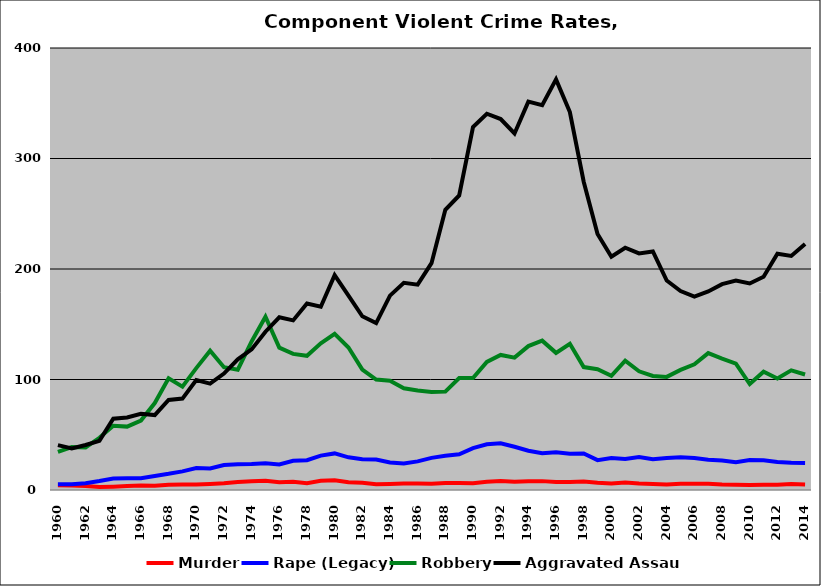
| Category | Murder | Rape (Legacy) | Robbery | Aggravated Assault |
|---|---|---|---|---|
| 1960.0 | 4.375 | 5.147 | 34.509 | 40.579 |
| 1961.0 | 4.076 | 5.307 | 38.824 | 37.635 |
| 1962.0 | 3.542 | 6.129 | 38.473 | 40.742 |
| 1963.0 | 2.769 | 8.095 | 47.273 | 44.525 |
| 1964.0 | 3.047 | 10.466 | 58.073 | 64.456 |
| 1965.0 | 3.541 | 10.563 | 57.359 | 65.589 |
| 1966.0 | 4.006 | 10.573 | 62.81 | 68.93 |
| 1967.0 | 3.76 | 12.66 | 78.66 | 67.78 |
| 1968.0 | 4.796 | 14.624 | 101.026 | 81.429 |
| 1969.0 | 4.982 | 16.882 | 93.552 | 82.728 |
| 1970.0 | 4.871 | 19.851 | 110.307 | 99.564 |
| 1971.0 | 5.347 | 19.435 | 126.014 | 96.284 |
| 1972.0 | 6.067 | 22.529 | 111.094 | 105.405 |
| 1973.0 | 7.299 | 23.307 | 108.822 | 118.209 |
| 1974.0 | 8.011 | 23.546 | 134.447 | 127.261 |
| 1975.0 | 8.454 | 24.308 | 156.807 | 143.269 |
| 1976.0 | 7.111 | 23.161 | 128.819 | 156.281 |
| 1977.0 | 7.411 | 26.492 | 123.171 | 153.49 |
| 1978.0 | 6.215 | 27 | 121.437 | 168.813 |
| 1979.0 | 8.296 | 31.13 | 132.722 | 165.889 |
| 1980.0 | 8.881 | 33.107 | 141.363 | 194.466 |
| 1981.0 | 7.098 | 29.565 | 128.979 | 175.96 |
| 1982.0 | 6.489 | 27.801 | 109.048 | 157.229 |
| 1983.0 | 5.22 | 27.542 | 99.909 | 151.086 |
| 1984.0 | 5.511 | 24.955 | 98.854 | 175.9 |
| 1985.0 | 5.801 | 23.968 | 92.108 | 187.525 |
| 1986.0 | 5.977 | 25.872 | 90.007 | 185.865 |
| 1987.0 | 5.551 | 29.091 | 88.61 | 205.243 |
| 1988.0 | 6.422 | 31.049 | 89.022 | 253.543 |
| 1989.0 | 6.311 | 32.255 | 101.395 | 266.53 |
| 1990.0 | 6.205 | 37.932 | 101.35 | 328.436 |
| 1991.0 | 7.54 | 41.319 | 115.971 | 340.499 |
| 1992.0 | 8.195 | 42.353 | 122.236 | 335.712 |
| 1993.0 | 7.527 | 39.104 | 119.814 | 322.633 |
| 1994.0 | 7.876 | 35.57 | 130.216 | 351.46 |
| 1995.0 | 8.03 | 33.259 | 135.171 | 348.285 |
| 1996.0 | 7.191 | 34.104 | 124.105 | 371.597 |
| 1997.0 | 7.333 | 32.879 | 132.384 | 342.053 |
| 1998.0 | 7.696 | 33.09 | 111.222 | 278.963 |
| 1999.0 | 6.579 | 27.041 | 109.307 | 231.655 |
| 2000.0 | 5.789 | 28.929 | 103.314 | 211.118 |
| 2001.0 | 6.741 | 28.008 | 117.044 | 219.268 |
| 2002.0 | 5.88 | 29.934 | 107.391 | 214.133 |
| 2003.0 | 5.452 | 27.744 | 103.249 | 215.87 |
| 2004.0 | 5.075 | 28.957 | 102.352 | 189.544 |
| 2005.0 | 5.681 | 29.62 | 108.665 | 180.035 |
| 2006.0 | 5.734 | 28.906 | 113.819 | 174.942 |
| 2007.0 | 5.579 | 27.343 | 123.871 | 179.724 |
| 2008.0 | 5.04 | 26.736 | 118.826 | 186.262 |
| 2009.0 | 4.857 | 25.237 | 114.384 | 189.55 |
| 2010.0 | 4.504 | 27.16 | 95.916 | 186.881 |
| 2011.0 | 4.696 | 26.978 | 107.069 | 193.022 |
| 2012.0 | 4.696 | 25.406 | 100.967 | 213.758 |
| 2013.0 | 5.433 | 24.701 | 108.268 | 211.773 |
| 2014.0 | 5.002 | 24.481 | 104.55 | 222.621 |